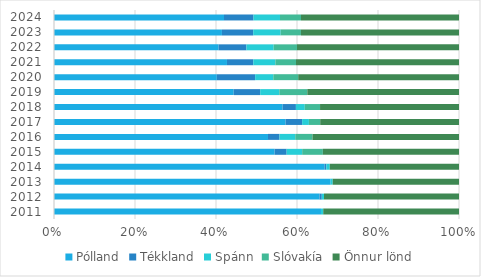
| Category | Pólland | Tékkland | Spánn | Slóvakía | Önnur lönd |
|---|---|---|---|---|---|
| 2011.0 | 0.659 | 0 | 0.006 | 0 | 0.335 |
| 2012.0 | 0.656 | 0.005 | 0.005 | 0 | 0.333 |
| 2013.0 | 0.683 | 0 | 0.005 | 0 | 0.312 |
| 2014.0 | 0.668 | 0.004 | 0.009 | 0 | 0.319 |
| 2015.0 | 0.545 | 0.03 | 0.038 | 0.051 | 0.336 |
| 2016.0 | 0.528 | 0.028 | 0.039 | 0.043 | 0.362 |
| 2017.0 | 0.572 | 0.041 | 0.017 | 0.028 | 0.343 |
| 2018.0 | 0.564 | 0.033 | 0.022 | 0.038 | 0.343 |
| 2019.0 | 0.444 | 0.065 | 0.047 | 0.069 | 0.375 |
| 2020.0 | 0.402 | 0.095 | 0.045 | 0.061 | 0.397 |
| 2021.0 | 0.427 | 0.065 | 0.054 | 0.051 | 0.402 |
| 2022.0 | 0.406 | 0.069 | 0.067 | 0.058 | 0.4 |
| 2023.0 | 0.415 | 0.077 | 0.068 | 0.05 | 0.39 |
| 2024.0 | 0.42 | 0.073 | 0.065 | 0.052 | 0.39 |